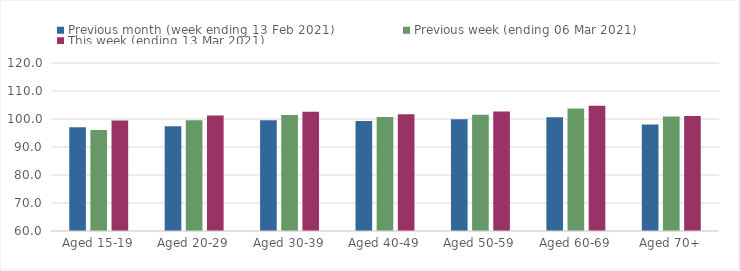
| Category | Previous month (week ending 13 Feb 2021) | Previous week (ending 06 Mar 2021) | This week (ending 13 Mar 2021) |
|---|---|---|---|
| Aged 15-19 | 97.08 | 96.09 | 99.44 |
| Aged 20-29 | 97.4 | 99.59 | 101.25 |
| Aged 30-39 | 99.51 | 101.43 | 102.62 |
| Aged 40-49 | 99.31 | 100.67 | 101.68 |
| Aged 50-59 | 99.92 | 101.51 | 102.7 |
| Aged 60-69 | 100.59 | 103.75 | 104.73 |
| Aged 70+ | 98.03 | 100.89 | 101.05 |